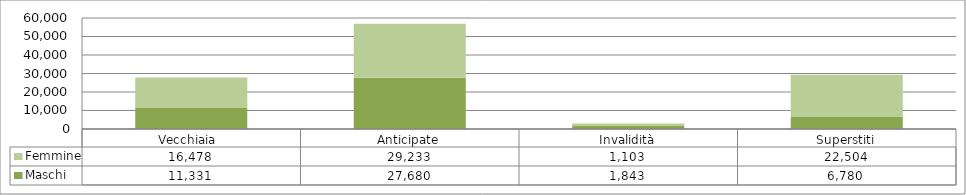
| Category | Maschi | Femmine |
|---|---|---|
| Vecchiaia  | 11331 | 16478 |
| Anticipate | 27680 | 29233 |
| Invalidità | 1843 | 1103 |
| Superstiti | 6780 | 22504 |